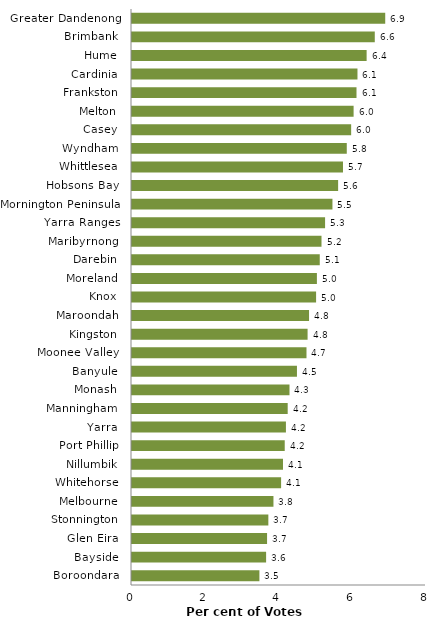
| Category | Series 0 |
|---|---|
| Boroondara  | 3.467 |
| Bayside  | 3.649 |
| Glen Eira  | 3.675 |
| Stonnington  | 3.71 |
| Melbourne  | 3.849 |
| Whitehorse  | 4.057 |
| Nillumbik  | 4.109 |
| Port Phillip  | 4.156 |
| Yarra  | 4.189 |
| Manningham  | 4.237 |
| Monash  | 4.286 |
| Banyule  | 4.489 |
| Moonee Valley  | 4.748 |
| Kingston  | 4.778 |
| Maroondah  | 4.818 |
| Knox  | 5.009 |
| Moreland  | 5.031 |
| Darebin  | 5.109 |
| Maribyrnong  | 5.157 |
| Yarra Ranges  | 5.254 |
| Mornington Peninsula  | 5.454 |
| Hobsons Bay  | 5.609 |
| Whittlesea  | 5.741 |
| Wyndham  | 5.844 |
| Casey  | 5.963 |
| Melton  | 6.03 |
| Frankston  | 6.109 |
| Cardinia  | 6.135 |
| Hume  | 6.384 |
| Brimbank  | 6.606 |
| Greater Dandenong  | 6.891 |